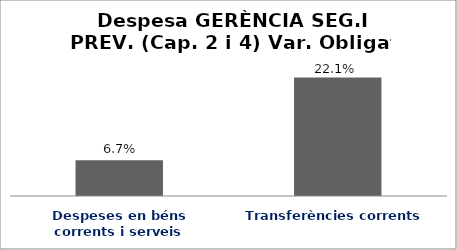
| Category | Series 0 |
|---|---|
| Despeses en béns corrents i serveis | 0.067 |
| Transferències corrents | 0.221 |